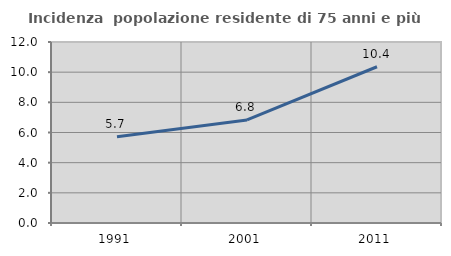
| Category | Incidenza  popolazione residente di 75 anni e più |
|---|---|
| 1991.0 | 5.725 |
| 2001.0 | 6.831 |
| 2011.0 | 10.36 |